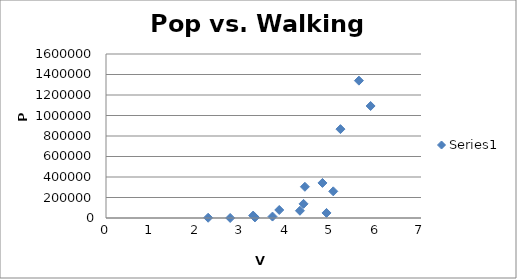
| Category | Series 0 |
|---|---|
| 2.27 | 2500 |
| 2.76 | 365 |
| 3.27 | 23700 |
| 3.31 | 5491 |
| 3.7 | 14000 |
| 3.85 | 78200 |
| 4.31 | 70700 |
| 4.39 | 138000 |
| 4.42 | 304500 |
| 4.81 | 341948 |
| 4.9 | 49375 |
| 5.05 | 260200 |
| 5.21 | 867023 |
| 5.62 | 1340000 |
| 5.88 | 1092759 |